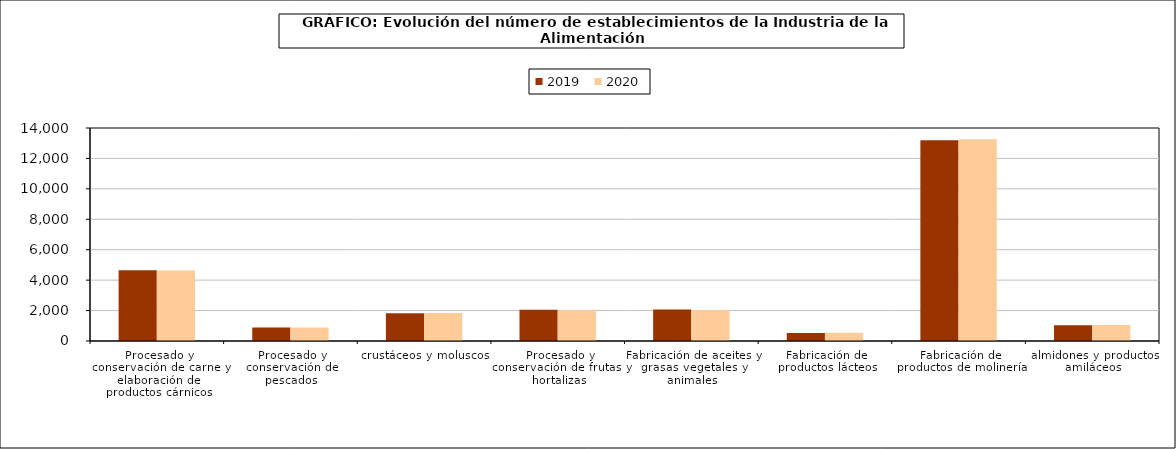
| Category | 2019 | 2020 |
|---|---|---|
| 0 | 4649 | 4640 |
| 1 | 895 | 881 |
| 2 | 1818 | 1842 |
| 3 | 2054 | 2026 |
| 4 | 2065 | 2043 |
| 5 | 531 | 537 |
| 6 | 13196 | 13259 |
| 7 | 1043 | 1050 |